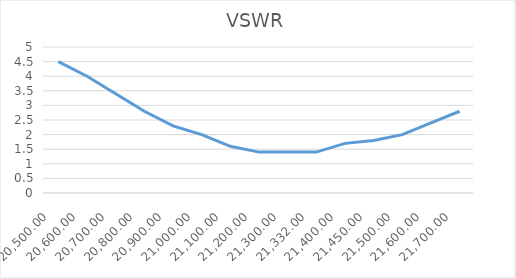
| Category | VSWR |
|---|---|
| 20500.0 | 4.5 |
| 20600.0 | 4 |
| 20700.0 | 3.4 |
| 20800.0 | 2.8 |
| 20900.0 | 2.3 |
| 21000.0 | 2 |
| 21100.0 | 1.6 |
| 21200.0 | 1.4 |
| 21300.0 | 1.4 |
| 21332.0 | 1.4 |
| 21400.0 | 1.7 |
| 21450.0 | 1.8 |
| 21500.0 | 2 |
| 21600.0 | 2.4 |
| 21700.0 | 2.8 |